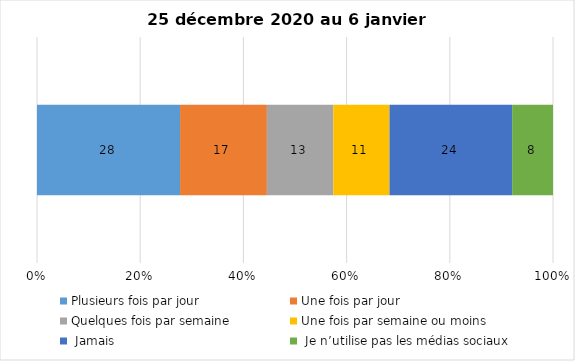
| Category | Plusieurs fois par jour | Une fois par jour | Quelques fois par semaine   | Une fois par semaine ou moins   |  Jamais   |  Je n’utilise pas les médias sociaux |
|---|---|---|---|---|---|---|
| 0 | 28 | 17 | 13 | 11 | 24 | 8 |